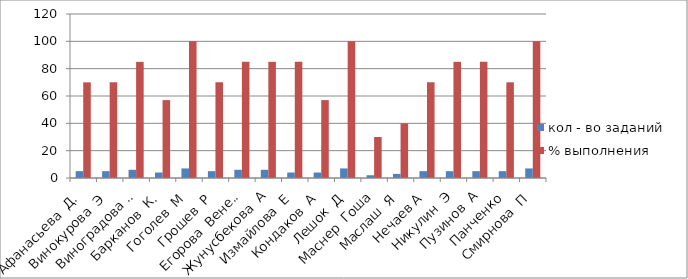
| Category | кол - во заданий  | % выполнения |
|---|---|---|
| Афанасьева  Д. | 5 | 70 |
| Винокурова  Э | 5 | 70 |
| Виноградова А. | 6 | 85 |
| Барканов  К. | 4 | 57 |
| Гоголев  М | 7 | 100 |
| Грошев  Р | 5 | 70 |
| Егорова  Венера | 6 | 85 |
| Жунусбекова  А | 6 | 85 |
| Измайлова  Е | 4 | 85 |
| Кондаков  А | 4 | 57 |
| Лешок  Д | 7 | 100 |
| Маснер  Гоша | 2 | 30 |
| Маслаш  Я | 3 | 40 |
| Нечаев А | 5 | 70 |
| Никулин  Э | 5 | 85 |
| Пузинов  А | 5 | 85 |
| Панченко | 5 | 70 |
| Смирнова  П | 7 | 100 |